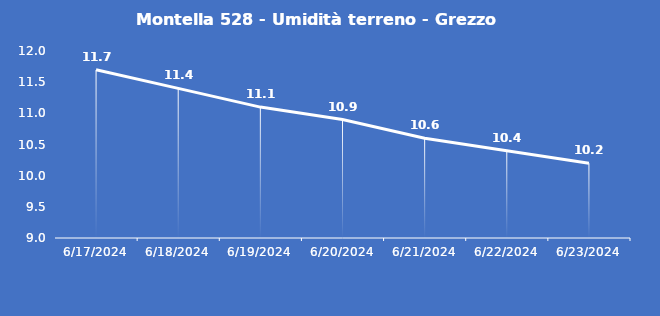
| Category | Montella 528 - Umidità terreno - Grezzo (%VWC) |
|---|---|
| 6/17/24 | 11.7 |
| 6/18/24 | 11.4 |
| 6/19/24 | 11.1 |
| 6/20/24 | 10.9 |
| 6/21/24 | 10.6 |
| 6/22/24 | 10.4 |
| 6/23/24 | 10.2 |